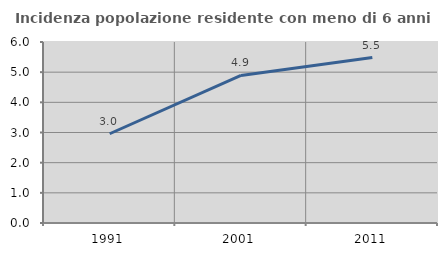
| Category | Incidenza popolazione residente con meno di 6 anni |
|---|---|
| 1991.0 | 2.959 |
| 2001.0 | 4.891 |
| 2011.0 | 5.484 |